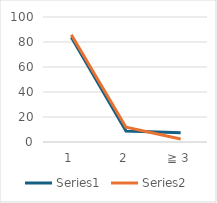
| Category | Series 0 | Series 1 |
|---|---|---|
| 1 | 83.706 | 85.789 |
| 2 | 8.85 | 11.849 |
| ≧ 3 | 7.444 | 2.362 |